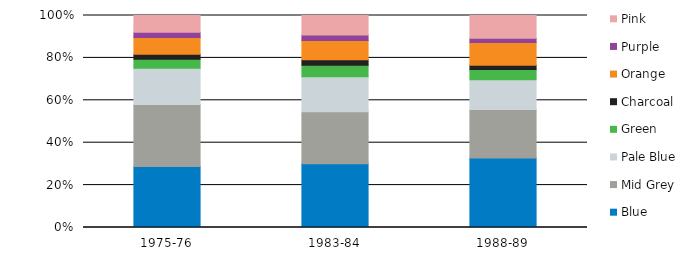
| Category | Blue | Mid Grey | Pale Blue | Green | Charcoal | Orange | Purple | Pink |
|---|---|---|---|---|---|---|---|---|
| 1975-76 | 36.19 | 36.88 | 21.56 | 5.36 | 3.01 | 10 | 3.01 | 10 |
| 1983-84 | 39.39 | 32.02 | 21.6 | 7.01 | 3.36 | 12 | 3.36 | 12 |
| 1988-89 | 42.78 | 29.91 | 18.35 | 6.33 | 2.63 | 14 | 2.63 | 14 |